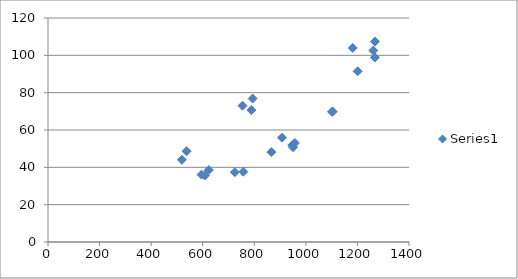
| Category | Series 0 |
|---|---|
| 519.25 | 44.035 |
| 866.4166666666666 | 48.137 |
| 1103.75 | 69.905 |
| 1101.5833333333333 | 69.736 |
| 537.4166666666666 | 48.646 |
| 907.5833333333334 | 55.866 |
| 757.5 | 37.641 |
| 1200.9166666666667 | 91.428 |
| 623.5833333333334 | 38.552 |
| 608.75 | 35.701 |
| 957.5 | 53.057 |
| 947.25 | 51.886 |
| 950.3333333333334 | 50.771 |
| 595.4166666666666 | 36.127 |
| 793.5 | 76.838 |
| 754.3333333333334 | 73.022 |
| 788.6666666666666 | 70.682 |
| 1261.6666666666667 | 102.564 |
| 1267.5833333333333 | 98.856 |
| 1268.0833333333333 | 107.346 |
| 1181.8333333333333 | 103.944 |
| 724.5 | 37.389 |